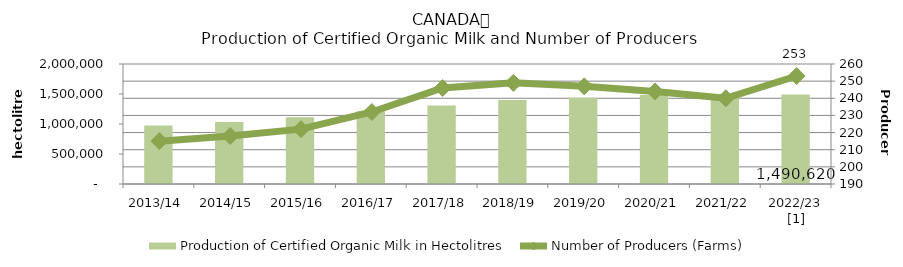
| Category | Production of Certified Organic Milk in Hectolitres |
|---|---|
| 2013/14 | 974302.43 |
| 2014/15 | 1033415.9 |
| 2015/16 | 1110663.63 |
| 2016/17 | 1213648.87 |
| 2017/18 | 1306888.08 |
| 2018/19 | 1397965.707 |
| 2019/20 | 1436387.46 |
| 2020/21 | 1484709.28 |
| 2021/22 | 1490378 |
| 2022/23 [1] | 1490619.88 |